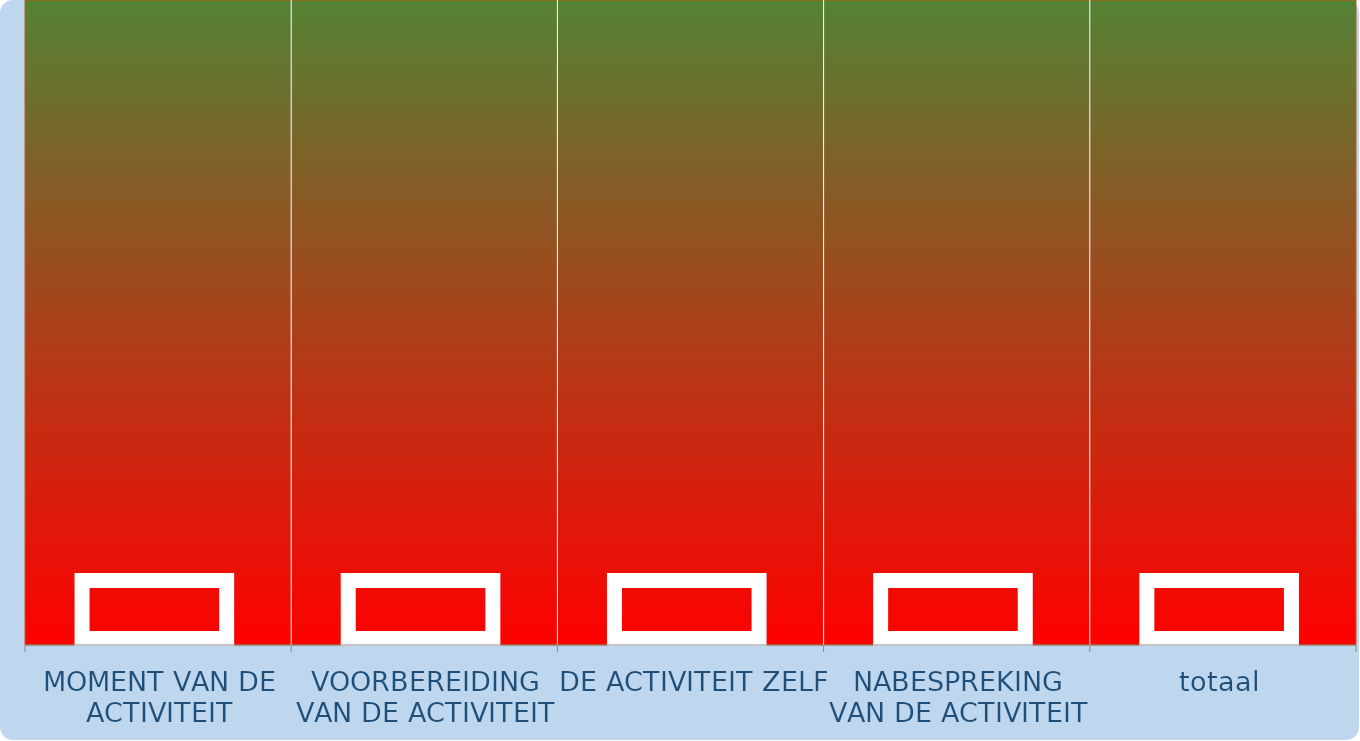
| Category | Series 0 |
|---|---|
| MOMENT VAN DE ACTIVITEIT | 10 |
| VOORBEREIDING VAN DE ACTIVITEIT | 10 |
| DE ACTIVITEIT ZELF | 10 |
| NABESPREKING VAN DE ACTIVITEIT | 10 |
| totaal | 10 |